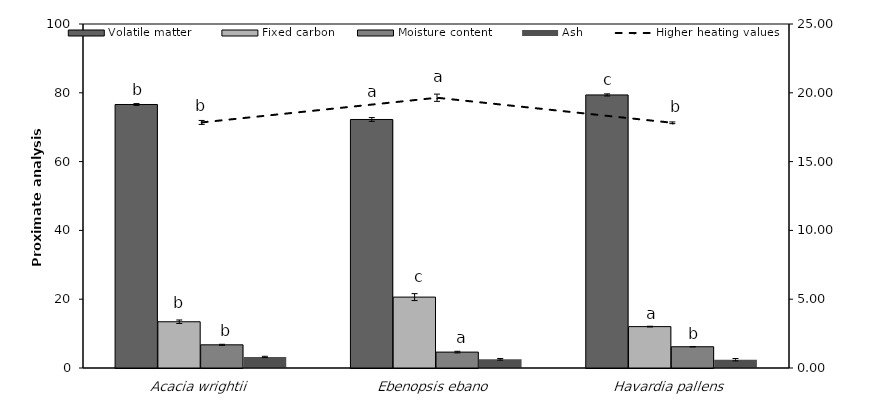
| Category | Volatile matter | Fixed carbon | Moisture content | Ash |
|---|---|---|---|---|
| Acacia wrightii | 76.6 | 13.443 | 6.739 | 3.218 |
| Ebenopsis ebano | 72.247 | 20.608 | 4.624 | 2.522 |
| Havardia pallens | 79.38 | 12.032 | 6.179 | 2.409 |